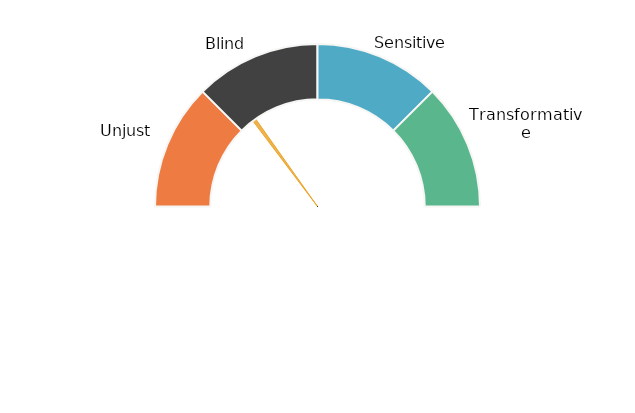
| Category | Needle |
|---|---|
| 0 | 29.412 |
| 1 | 1 |
| 2 | 169.588 |